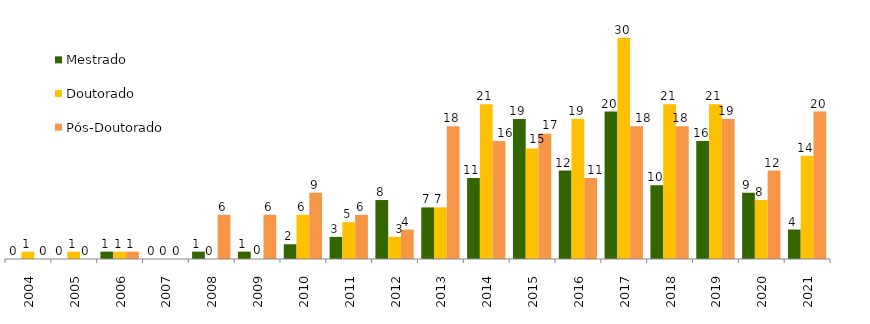
| Category | Mestrado | Doutorado | Pós-Doutorado |
|---|---|---|---|
| 2004.0 | 0 | 1 | 0 |
| 2005.0 | 0 | 1 | 0 |
| 2006.0 | 1 | 1 | 1 |
| 2007.0 | 0 | 0 | 0 |
| 2008.0 | 1 | 0 | 6 |
| 2009.0 | 1 | 0 | 6 |
| 2010.0 | 2 | 6 | 9 |
| 2011.0 | 3 | 5 | 6 |
| 2012.0 | 8 | 3 | 4 |
| 2013.0 | 7 | 7 | 18 |
| 2014.0 | 11 | 21 | 16 |
| 2015.0 | 19 | 15 | 17 |
| 2016.0 | 12 | 19 | 11 |
| 2017.0 | 20 | 30 | 18 |
| 2018.0 | 10 | 21 | 18 |
| 2019.0 | 16 | 21 | 19 |
| 2020.0 | 9 | 8 | 12 |
| 2021.0 | 4 | 14 | 20 |